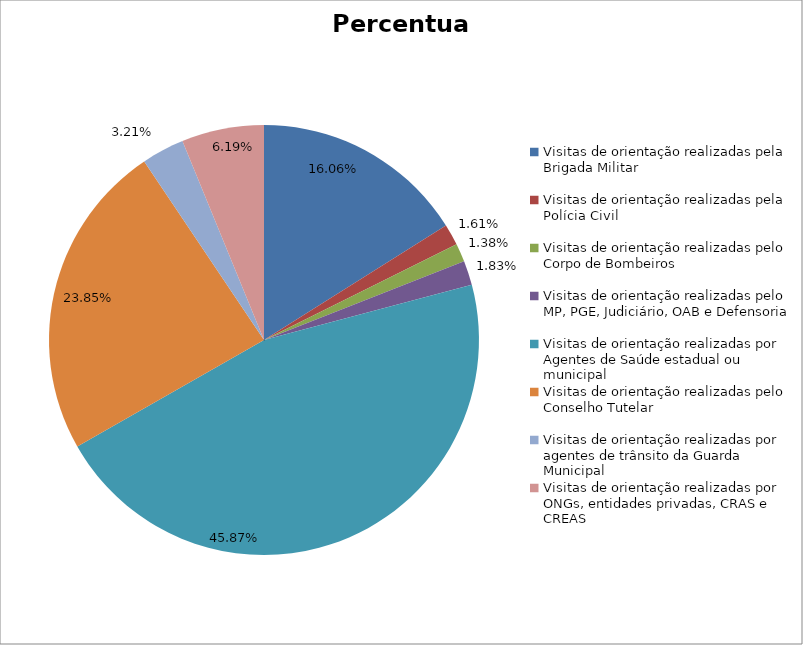
| Category | Percentual |
|---|---|
| Visitas de orientação realizadas pela Brigada Militar | 0.161 |
| Visitas de orientação realizadas pela Polícia Civil | 0.016 |
| Visitas de orientação realizadas pelo Corpo de Bombeiros | 0.014 |
| Visitas de orientação realizadas pelo MP, PGE, Judiciário, OAB e Defensoria | 0.018 |
| Visitas de orientação realizadas por Agentes de Saúde estadual ou municipal | 0.459 |
| Visitas de orientação realizadas pelo Conselho Tutelar | 0.239 |
| Visitas de orientação realizadas por agentes de trânsito da Guarda Municipal | 0.032 |
| Visitas de orientação realizadas por ONGs, entidades privadas, CRAS e CREAS | 0.062 |